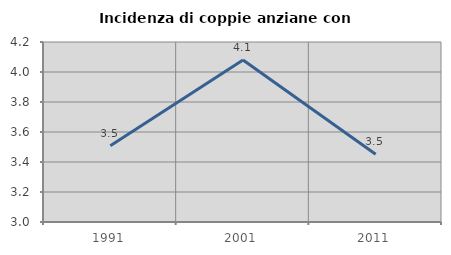
| Category | Incidenza di coppie anziane con figli |
|---|---|
| 1991.0 | 3.509 |
| 2001.0 | 4.079 |
| 2011.0 | 3.452 |